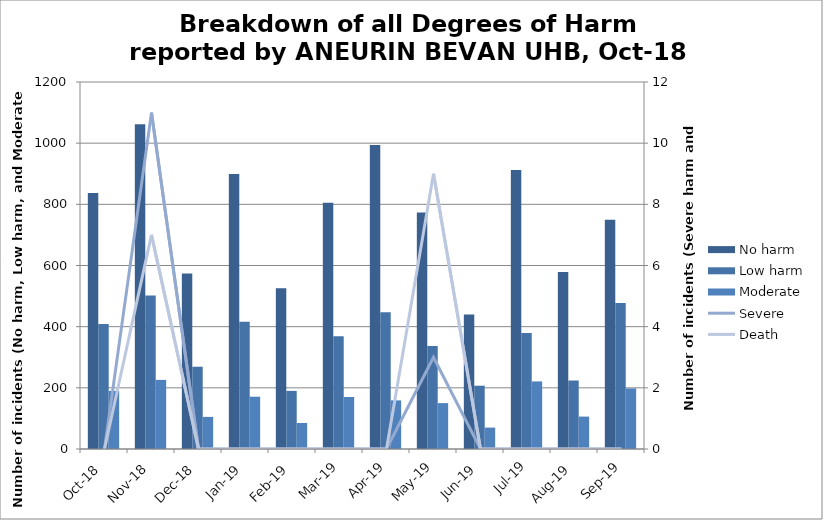
| Category | No harm | Low harm | Moderate |
|---|---|---|---|
| Oct-18 | 837 | 409 | 190 |
| Nov-18 | 1062 | 502 | 226 |
| Dec-18 | 574 | 269 | 105 |
| Jan-19 | 899 | 416 | 171 |
| Feb-19 | 526 | 190 | 85 |
| Mar-19 | 805 | 369 | 170 |
| Apr-19 | 994 | 447 | 159 |
| May-19 | 773 | 337 | 150 |
| Jun-19 | 440 | 207 | 70 |
| Jul-19 | 912 | 379 | 221 |
| Aug-19 | 579 | 224 | 106 |
| Sep-19 | 750 | 477 | 198 |